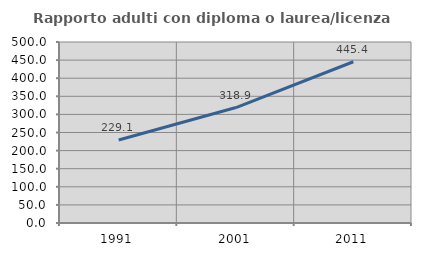
| Category | Rapporto adulti con diploma o laurea/licenza media  |
|---|---|
| 1991.0 | 229.101 |
| 2001.0 | 318.941 |
| 2011.0 | 445.389 |